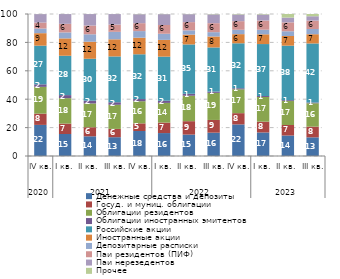
| Category | Денежные средства и депозиты | Госуд. и муниц. облигации | Облигации резидентов | Облигации иностранных эмитентов | Российские акции | Иностранные акции | Депозитарные расписки | Паи резидентов (ПИФ) | Паи нерезедентов | Прочее |
|---|---|---|---|---|---|---|---|---|---|---|
| 0 | 21.907 | 7.939 | 18.844 | 1.788 | 27.226 | 8.799 | 3.275 | 4.187 | 5.972 | 0.063 |
| 1 | 15.498 | 7.304 | 17.932 | 2.153 | 27.714 | 12.226 | 4.209 | 6.034 | 6.9 | 0.031 |
| 2 | 13.862 | 6.387 | 16.762 | 1.954 | 29.515 | 12.006 | 5.219 | 6.187 | 8.075 | 0.033 |
| 3 | 13.243 | 5.842 | 16.982 | 1.775 | 32.274 | 12.055 | 5.265 | 5.102 | 7.427 | 0.035 |
| 4 | 17.588 | 5.392 | 15.586 | 1.545 | 31.519 | 11.698 | 4.637 | 5.579 | 6.308 | 0.148 |
| 5 | 16.148 | 7.383 | 13.862 | 1.535 | 31.044 | 11.804 | 4.309 | 6.171 | 7.634 | 0.11 |
| 6 | 15.07 | 9.454 | 17.919 | 1.377 | 34.746 | 6.943 | 2.965 | 5.801 | 5.608 | 0.117 |
| 7 | 16.433 | 8.958 | 19.069 | 0.892 | 31.094 | 7.729 | 3.035 | 6.333 | 6.217 | 0.241 |
| 8 | 22.233 | 7.94 | 16.81 | 0.741 | 31.651 | 6.437 | 3.08 | 6.062 | 4.743 | 0.303 |
| 9 | 16.578 | 7.639 | 17.332 | 0.683 | 36.607 | 6.872 | 3.212 | 6.491 | 4.247 | 0.338 |
| 10 | 14.42 | 7.398 | 16.888 | 0.619 | 38.376 | 6.796 | 3.354 | 6.263 | 3.37 | 2.517 |
| 11 | 13.142 | 7.552 | 16.455 | 0.521 | 41.586 | 6.515 | 3.654 | 5.912 | 3.075 | 1.587 |